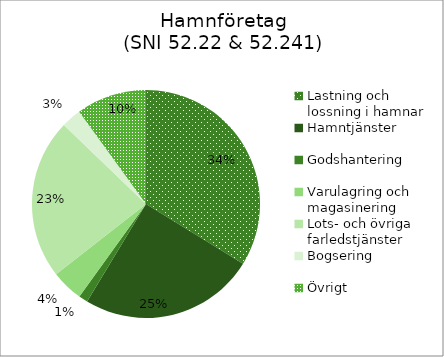
| Category | Bogsering Hamntjänster Lots- och övriga farledstjänster Varulagring och magasinering Godshantering Lastning och lossning i hamnar Övrigt |
|---|---|
| Lastning och lossning i hamnar | 3275.347 |
| Hamntjänster | 2408.165 |
| Godshantering | 125.028 |
| Varulagring och magasinering | 438.21 |
| Lots- och övriga farledstjänster | 2203.699 |
| Bogsering | 274.224 |
| Övrigt | 967 |